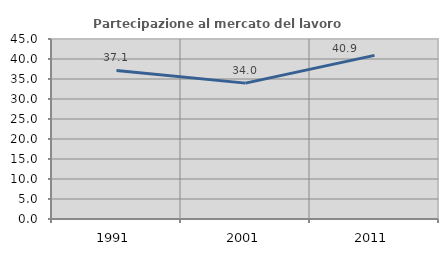
| Category | Partecipazione al mercato del lavoro  femminile |
|---|---|
| 1991.0 | 37.143 |
| 2001.0 | 33.968 |
| 2011.0 | 40.909 |